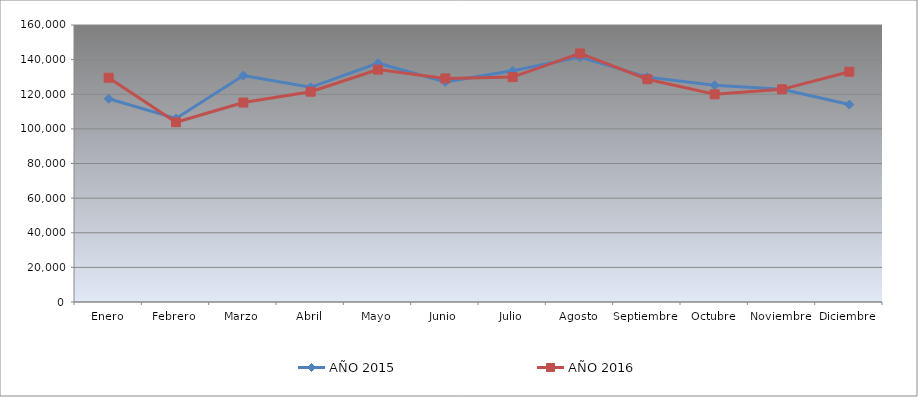
| Category | AÑO 2015 | AÑO 2016 |
|---|---|---|
| Enero | 117420 | 129540 |
| Febrero | 106020 | 103820 |
| Marzo | 130820 | 115200 |
| Abril | 124000 | 121480 |
| Mayo | 137940 | 134240 |
| Junio | 127160 | 129160 |
| Julio | 133560 | 129900 |
| Agosto | 141500 | 143580 |
| Septiembre | 129880 | 128680 |
| Octubre | 125160 | 119960 |
| Noviembre | 122900 | 122840 |
| Diciembre | 114040 | 133020 |